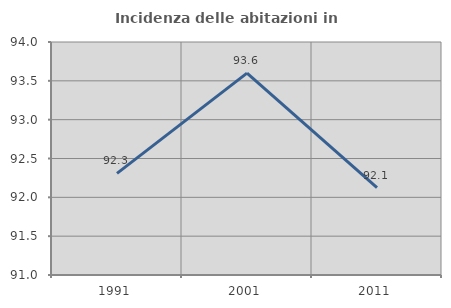
| Category | Incidenza delle abitazioni in proprietà  |
|---|---|
| 1991.0 | 92.308 |
| 2001.0 | 93.6 |
| 2011.0 | 92.126 |